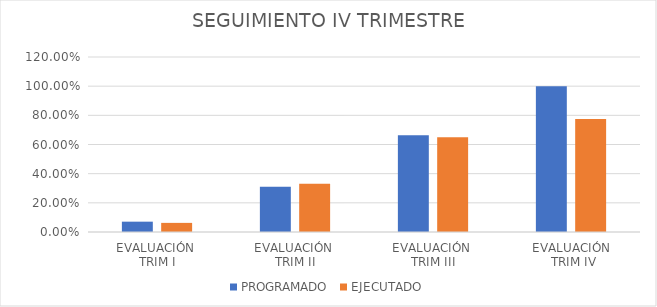
| Category | PROGRAMADO | EJECUTADO |
|---|---|---|
| EVALUACIÓN 
TRIM I | 0.071 | 0.062 |
| EVALUACIÓN 
TRIM II | 0.311 | 0.331 |
| EVALUACIÓN 
TRIM III | 0.664 | 0.65 |
| EVALUACIÓN
 TRIM IV | 1 | 0.775 |